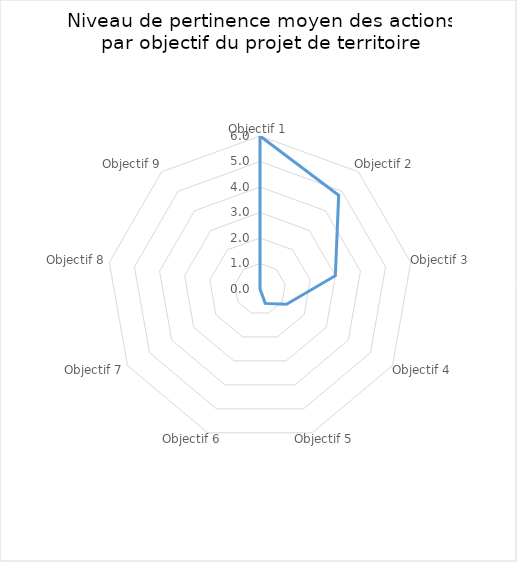
| Category | Series 0 |
|---|---|
| Objectif 1 | 6 |
| Objectif 2 | 4.8 |
| Objectif 3 | 3 |
| Objectif 4 | 1.2 |
| Objectif 5 | 0.6 |
| Objectif 6 | 0 |
| Objectif 7 | 0 |
| Objectif 8 | 0 |
| Objectif 9 | 0 |